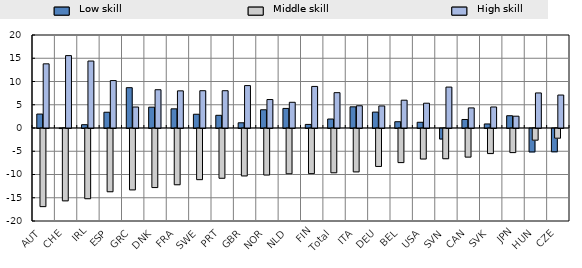
| Category | Low skill | Middle skill | High skill |
|---|---|---|---|
| AUT | 3 | -16.8 | 13.8 |
| CHE | -0.01 | -15.56 | 15.57 |
| IRL | 0.71 | -15.1 | 14.4 |
| ESP | 3.39 | -13.6 | 10.2 |
| GRC | 8.67 | -13.2 | 4.51 |
| DNK | 4.48 | -12.7 | 8.23 |
| FRA | 4.12 | -12.1 | 7.99 |
| SWE | 2.96 | -11 | 8.02 |
| PRT | 2.73 | -10.7 | 8.02 |
| GBR | 1.12 | -10.2 | 9.12 |
| NOR | 3.92 | -10 | 6.12 |
| NLD | 4.21 | -9.74 | 5.53 |
| FIN | 0.77 | -9.71 | 8.94 |
| Total | 1.93 | -9.52 | 7.6 |
| ITA | 4.55 | -9.33 | 4.78 |
| DEU | 3.42 | -8.16 | 4.74 |
| BEL | 1.35 | -7.33 | 5.98 |
| USA | 1.23 | -6.56 | 5.33 |
| SVN | -2.26 | -6.5 | 8.8 |
| CAN | 1.83 | -6.15 | 4.32 |
| SVK | 0.87 | -5.39 | 4.52 |
| JPN | 2.64 | -5.18 | 2.54 |
| HUN | -5.04 | -2.51 | 7.54 |
| CZE | -5.01 | -2.08 | 7.09 |